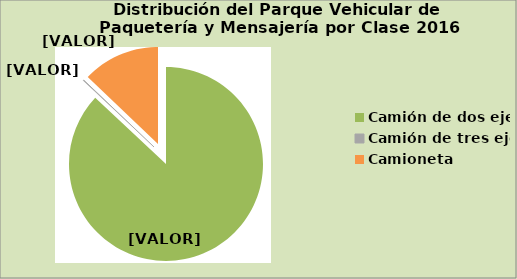
| Category | Series 0 |
|---|---|
| Camión de dos ejes | 86.981 |
| Camión de tres ejes | 0.128 |
| Camioneta | 12.891 |